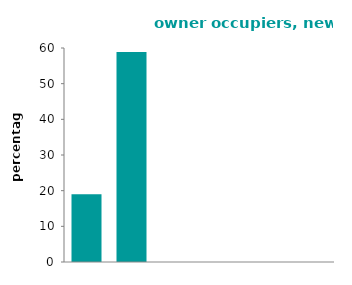
| Category | new households moving into owner occupation |
|---|---|
| 16-24 | 19.021 |
| 25-34 | 58.88 |
| 35-44 | 0 |
| 45-54 | 0 |
| 55-64 | 0 |
| 65 or over | 0 |